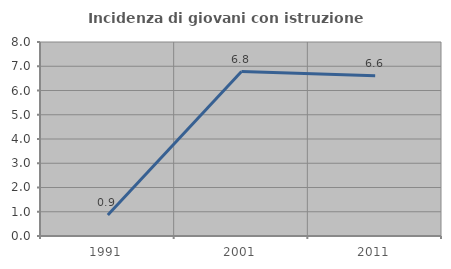
| Category | Incidenza di giovani con istruzione universitaria |
|---|---|
| 1991.0 | 0.87 |
| 2001.0 | 6.78 |
| 2011.0 | 6.612 |